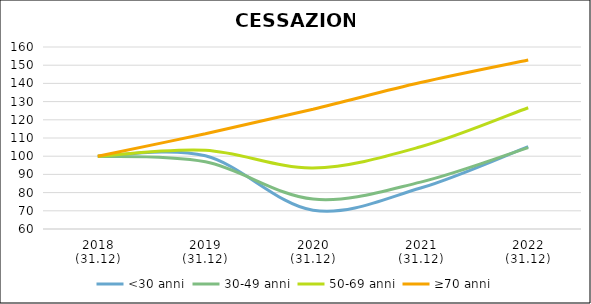
| Category | <30 anni | 30-49 anni | 50-69 anni | ≥70 anni |
|---|---|---|---|---|
| 2018
(31.12) | 100 | 100 | 100 | 100 |
| 2019
(31.12) | 100.214 | 96.898 | 103.256 | 112.36 |
| 2020
(31.12) | 70.343 | 76.424 | 93.57 | 125.843 |
| 2021
(31.12) | 82.52 | 85.768 | 105.167 | 140.449 |
| 2022
(31.12) | 105.302 | 104.75 | 126.633 | 152.809 |